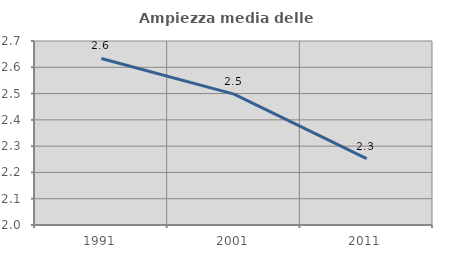
| Category | Ampiezza media delle famiglie |
|---|---|
| 1991.0 | 2.634 |
| 2001.0 | 2.498 |
| 2011.0 | 2.253 |